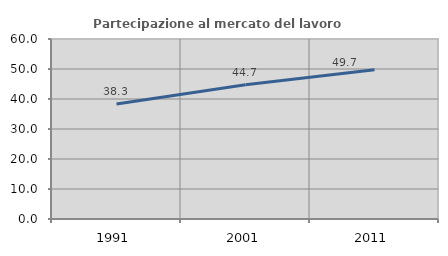
| Category | Partecipazione al mercato del lavoro  femminile |
|---|---|
| 1991.0 | 38.311 |
| 2001.0 | 44.734 |
| 2011.0 | 49.749 |